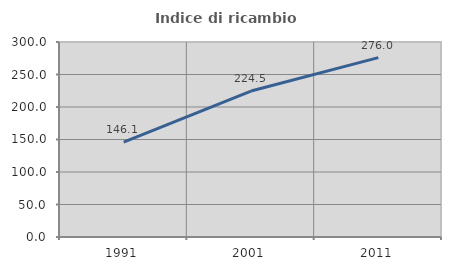
| Category | Indice di ricambio occupazionale  |
|---|---|
| 1991.0 | 146.087 |
| 2001.0 | 224.528 |
| 2011.0 | 276 |